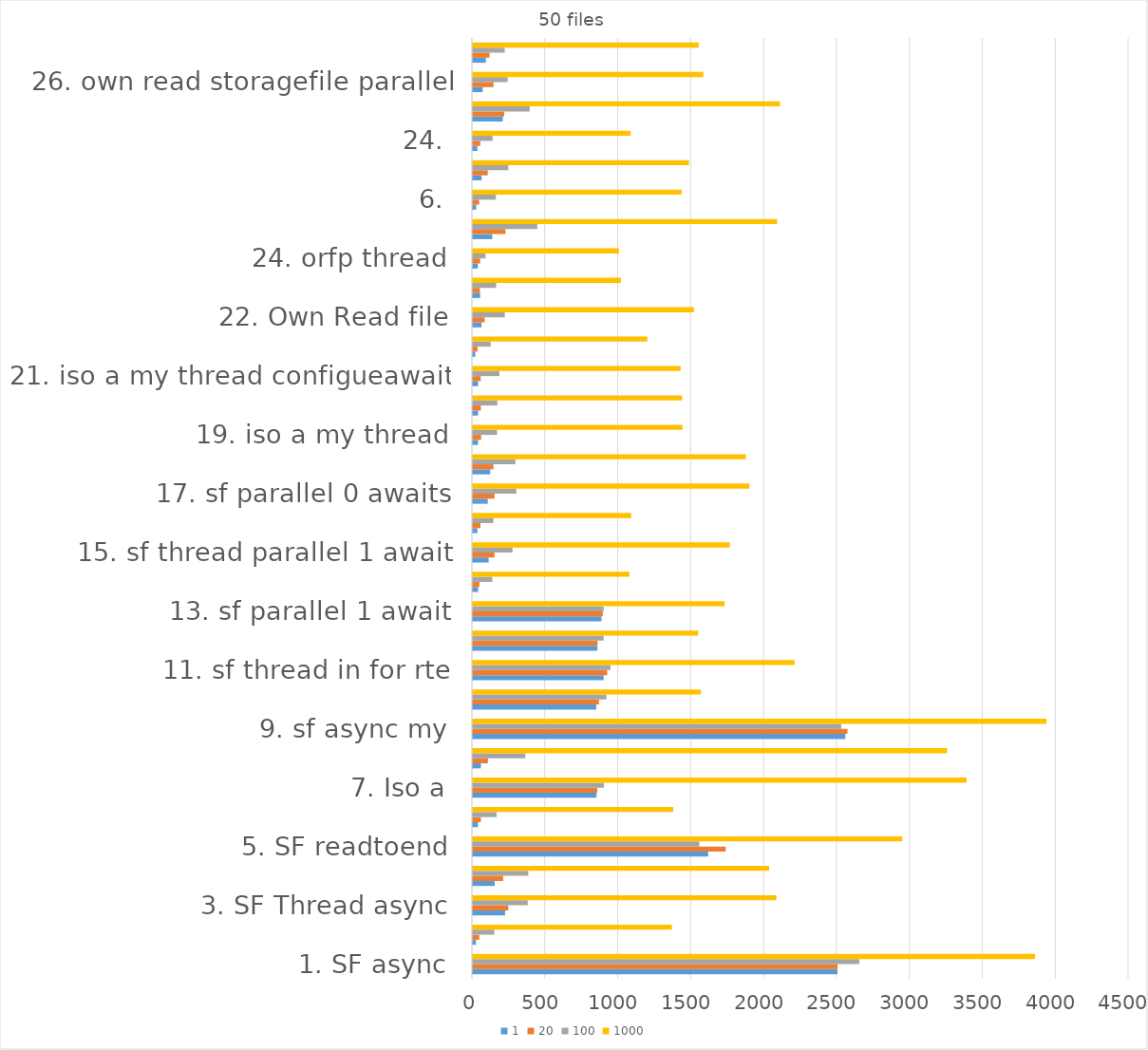
| Category | 1 | 20 | 100 | 1000 |
|---|---|---|---|---|
| 1. SF async | 2501 | 2501 | 2651 | 3856 |
| 2. Iso | 21 | 44 | 147 | 1365 |
| 3. SF Thread async | 221 | 243 | 376 | 2082 |
| 4. sf thread rte | 150 | 208 | 380 | 2032 |
| 5. SF readtoend | 1614 | 1734 | 1553 | 2946 |
| 6. iso thread rte | 35 | 55 | 163 | 1374 |
| 7. Iso a | 848 | 853 | 899 | 3386 |
| 8. Iso thread async | 55 | 103 | 360 | 3252 |
| 9. sf async my | 2554 | 2569 | 2526 | 3934 |
| 10. iso a my | 846 | 865 | 916 | 1564 |
| 11. sf thread in for rte | 897 | 921 | 944 | 2206 |
| 12. Iso thread in for | 854 | 855 | 897 | 1545 |
| 13. sf parallel 1 await | 882 | 891 | 897 | 1726 |
| 14. iso parallel | 36 | 45 | 133 | 1074 |
| 15. sf thread parallel 1 await | 108 | 148 | 272 | 1762 |
| 16. iso parallel thread | 31 | 52 | 141 | 1086 |
| 17. sf parallel 0 awaits | 102 | 148 | 298 | 1897 |
| 18. sf parallel thread 0 awaits | 119 | 141 | 292 | 1872 |
| 19. iso a my thread | 35 | 57 | 166 | 1438 |
| 20. iso a my configueawait | 36 | 55 | 168 | 1435 |
| 21. iso a my thread configueawait | 36 | 54 | 182 | 1425 |
| 16. iso parallel thread | 16 | 32 | 122 | 1197 |
| 22. Own Read file | 59 | 81 | 219 | 1516 |
| 23. own read file parallel | 50 | 48 | 160 | 1015 |
| 24. orfp thread | 34 | 50 | 87 | 1002 |
| 4. | 133 | 224 | 442 | 2087 |
| 6. | 23 | 43 | 158 | 1432 |
| 22. | 60 | 102 | 243 | 1482 |
| 24. | 31 | 51 | 135 | 1082 |
| 25. own read storagefile | 205 | 215 | 390 | 2107 |
| 26. own read storagefile parallel | 67 | 142 | 239 | 1581 |
| 27. or storagefile par thread | 89 | 114 | 218 | 1549 |